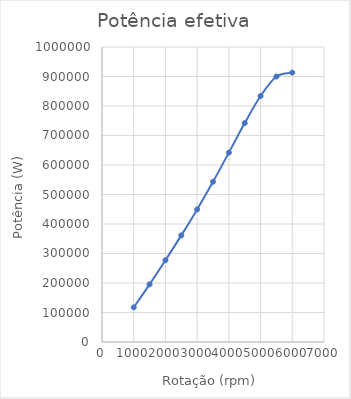
| Category | Potência efetiva |
|---|---|
| 1000.0 | 117381.947 |
| 1500.0 | 195407.536 |
| 2000.0 | 277086.042 |
| 2500.0 | 361374.446 |
| 3000.0 | 449527.188 |
| 3500.0 | 543087.657 |
| 4000.0 | 641879.665 |
| 4500.0 | 741998.939 |
| 5000.0 | 833804.598 |
| 5500.0 | 899910.639 |
| 6000.0 | 913177.42 |